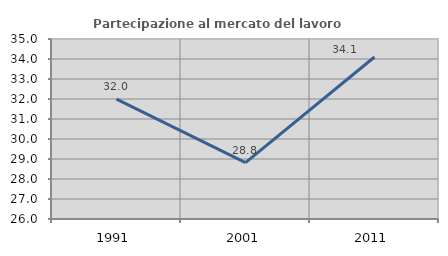
| Category | Partecipazione al mercato del lavoro  femminile |
|---|---|
| 1991.0 | 31.993 |
| 2001.0 | 28.819 |
| 2011.0 | 34.101 |